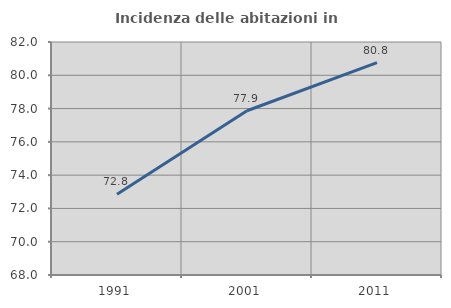
| Category | Incidenza delle abitazioni in proprietà  |
|---|---|
| 1991.0 | 72.846 |
| 2001.0 | 77.869 |
| 2011.0 | 80.759 |